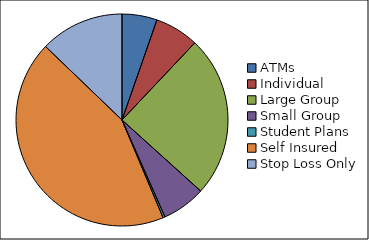
| Category | Total |
|---|---|
| ATMs | 125064 |
| Individual | 156735 |
| Large Group | 576720 |
| Small Group | 155885 |
| Student Plans | 7280 |
| Self Insured | 1018284 |
| Stop Loss Only | 299914 |